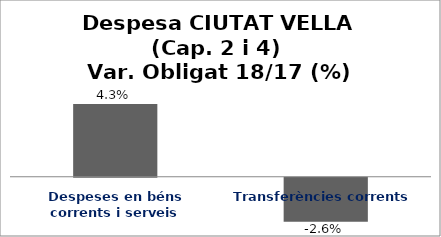
| Category | Series 0 |
|---|---|
| Despeses en béns corrents i serveis | 0.043 |
| Transferències corrents | -0.026 |